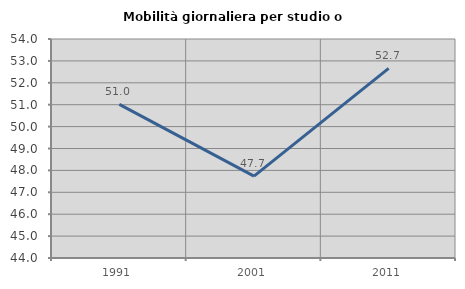
| Category | Mobilità giornaliera per studio o lavoro |
|---|---|
| 1991.0 | 51.013 |
| 2001.0 | 47.742 |
| 2011.0 | 52.656 |